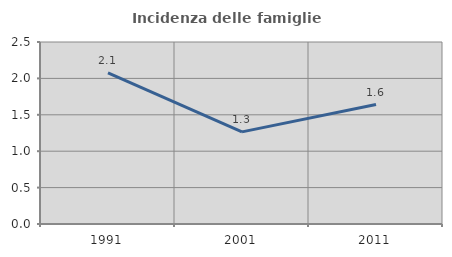
| Category | Incidenza delle famiglie numerose |
|---|---|
| 1991.0 | 2.077 |
| 2001.0 | 1.266 |
| 2011.0 | 1.641 |